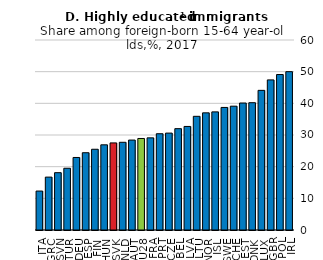
| Category | 2017 |
|---|---|
| ITA | 12.3 |
| GRC | 16.7 |
| SVN | 18.1 |
| TUR | 19.5 |
| DEU | 22.9 |
| ESP | 24.4 |
| FIN | 25.5 |
| HUN | 26.9 |
| SVK | 27.5 |
| NLD | 27.7 |
| AUT | 28.4 |
| EU28 | 28.9 |
| FRA | 29.1 |
| PRT | 30.4 |
| CZE | 30.6 |
| BEL | 32 |
| LVA | 32.7 |
| LTU | 35.9 |
| NOR | 37 |
| ISL | 37.3 |
| SWE | 38.7 |
| CHE | 39.1 |
| EST | 40.1 |
| DNK | 40.2 |
| LUX | 44.1 |
| GBR | 47.4 |
| POL | 49.1 |
| IRL | 50 |